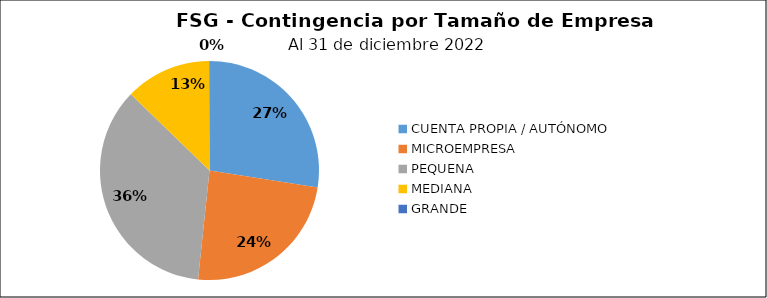
| Category | Saldo | Créditos |
|---|---|---|
| CUENTA PROPIA / AUTÓNOMO | 37.731 | 4603 |
| MICROEMPRESA | 33.213 | 13892 |
| PEQUENA | 48.837 | 4247 |
| MEDIANA | 17.435 | 376 |
| GRANDE | 0.089 | 1 |